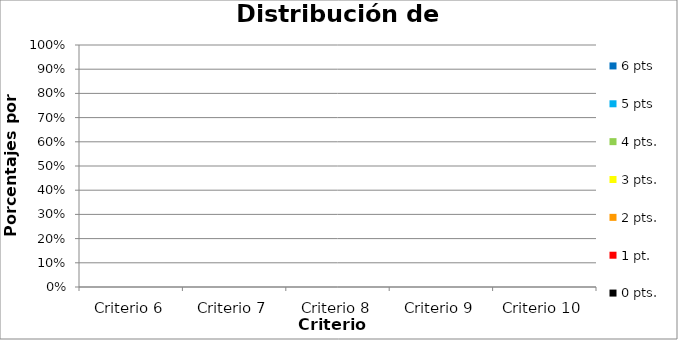
| Category | 6 pts | 5 pts | 4 pts. | 3 pts. | 2 pts. | 1 pt. | 0 pts. |
|---|---|---|---|---|---|---|---|
| Criterio 6 | 0 | 0 | 0 | 0 | 0 | 0 | 0 |
| Criterio 7 | 0 | 0 | 0 | 0 | 0 | 0 | 0 |
| Criterio 8 | 0 | 0 | 0 | 0 | 0 | 0 | 0 |
| Criterio 9 | 0 | 0 | 0 | 0 | 0 | 0 | 0 |
| Criterio 10 | 0 | 0 | 0 | 0 | 0 | 0 | 0 |